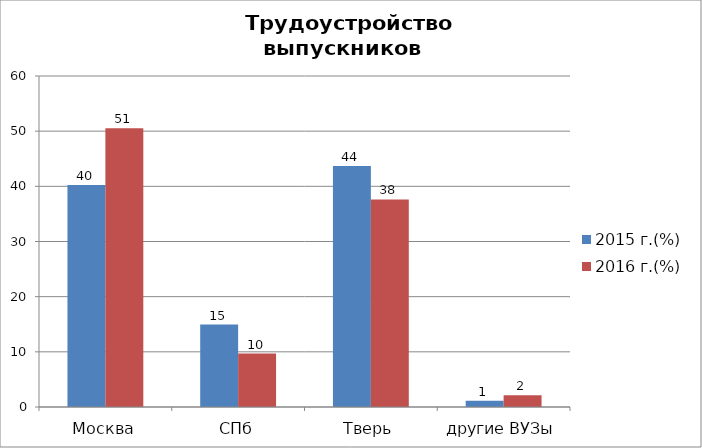
| Category | 2015 г.(%) | 2016 г.(%) |
|---|---|---|
| Москва | 40.23 | 50.538 |
| СПб | 14.943 | 9.677 |
| Тверь | 43.678 | 37.634 |
| другие ВУЗы | 1.149 | 2.151 |